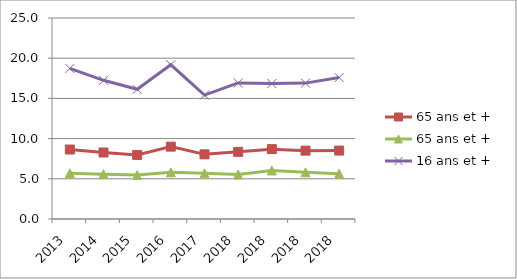
| Category | 65 ans et + | 16 ans et + |
|---|---|---|
| 2013.0 | 5.69 | 18.73 |
| 2014.0 | 5.58 | 17.25 |
| 2015.0 | 5.47 | 16.13 |
| 2016.0 | 5.8 | 19.18 |
| 2017.0 | 5.68 | 15.41 |
| 2018.0 | 5.53 | 16.92 |
| 2018.0 | 6.04 | 16.85 |
| 2018.0 | 5.8 | 16.9 |
| 2018.0 | 5.63 | 17.59 |